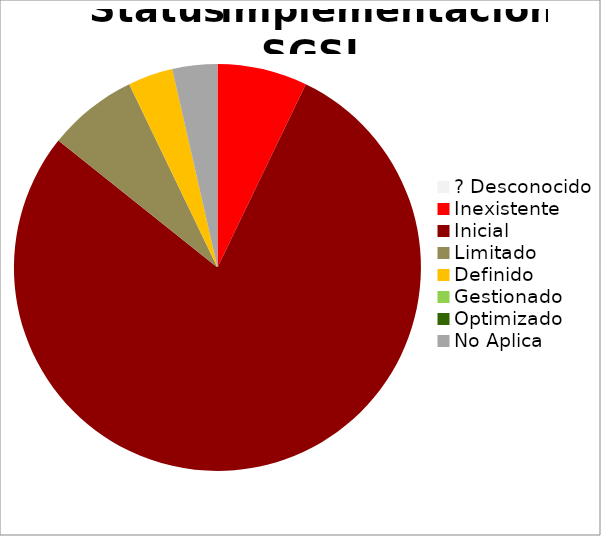
| Category | Series 0 |
|---|---|
| ? Desconocido | 0 |
| Inexistente | 0.071 |
| Inicial | 0.786 |
| Limitado | 0.071 |
| Definido | 0.036 |
| Gestionado | 0 |
| Optimizado | 0 |
| No Aplica | 0.036 |